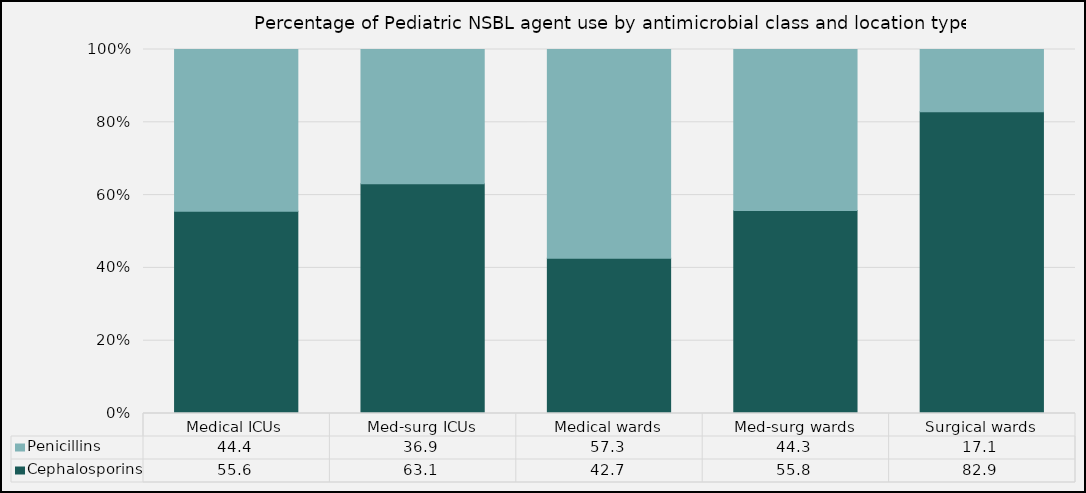
| Category | Cephalosporins | Penicillins |
|---|---|---|
| Medical ICUs | 55.59 | 44.41 |
| Med-surg ICUs | 63.1 | 36.9 |
| Medical wards | 42.67 | 57.33 |
| Med-surg wards | 55.75 | 44.25 |
| Surgical wards | 82.9 | 17.1 |